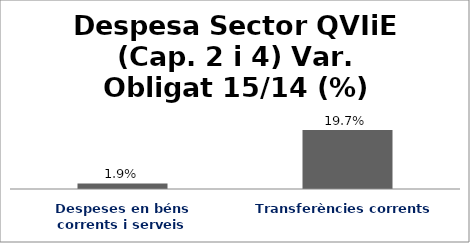
| Category | Series 0 |
|---|---|
| Despeses en béns corrents i serveis | 0.019 |
| Transferències corrents | 0.197 |